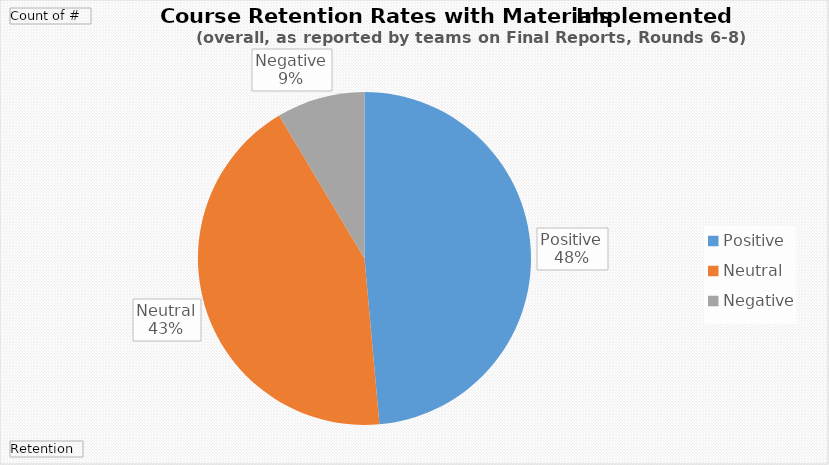
| Category | Total |
|---|---|
| Positive | 17 |
| Neutral | 15 |
| Negative | 3 |